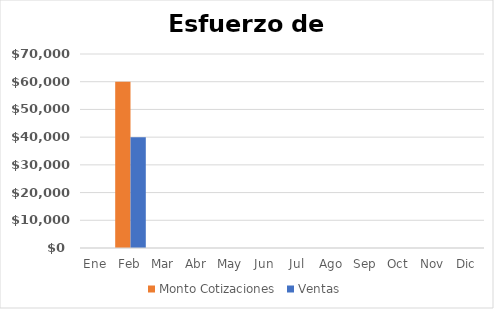
| Category | Monto Cotizaciones | Ventas |
|---|---|---|
| Ene | 0 | 0 |
| Feb | 60000 | 40000 |
| Mar | 0 | 0 |
| Abr | 0 | 0 |
| May | 0 | 0 |
| Jun | 0 | 0 |
| Jul | 0 | 0 |
| Ago | 0 | 0 |
| Sep | 0 | 0 |
| Oct | 0 | 0 |
| Nov | 0 | 0 |
| Dic | 0 | 0 |